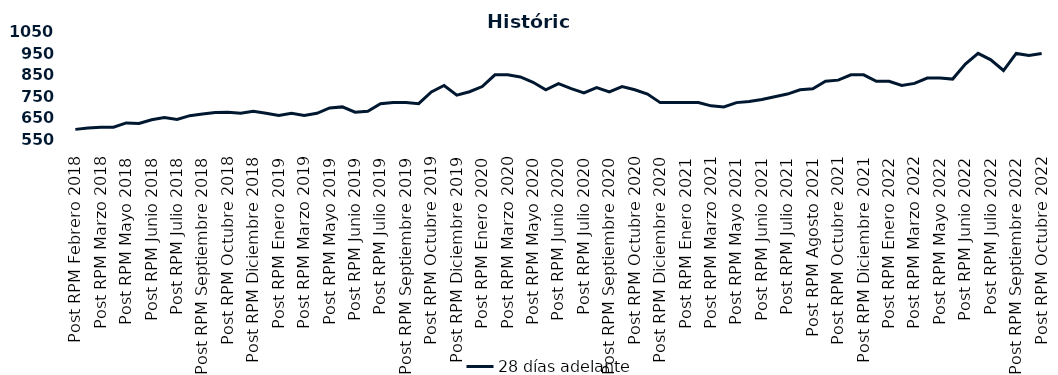
| Category | 28 días adelante |
|---|---|
| Post RPM Febrero 2018 | 595 |
| Pre RPM Marzo 2018 | 601 |
| Post RPM Marzo 2018 | 605 |
| Pre RPM Mayo 2018 | 605 |
| Post RPM Mayo 2018 | 625 |
| Pre RPM Junio 2018 | 623 |
| Post RPM Junio 2018 | 640 |
| Pre RPM Julio 2018 | 650 |
| Post RPM Julio 2018 | 641 |
| Pre RPM Septiembre 2018 | 659 |
| Post RPM Septiembre 2018 | 666.75 |
| Pre RPM Octubre 2018 | 674 |
| Post RPM Octubre 2018 | 675 |
| Pre RPM Diciembre 2018 | 670 |
| Post RPM Diciembre 2018 | 680 |
| Pre RPM Enero 2019 | 670 |
| Post RPM Enero 2019 | 660 |
| Pre RPM Marzo 2019 | 670 |
| Post RPM Marzo 2019 | 660 |
| Pre RPM Mayo 2019 | 670 |
| Post RPM Mayo 2019 | 695 |
| Pre RPM Junio 2019 | 700 |
| Post RPM Junio 2019 | 675 |
| Pre RPM Julio 2019 | 680 |
| Post RPM Julio 2019 | 715 |
| Pre RPM Septiembre 2019 | 720 |
| Post RPM Septiembre 2019 | 720 |
| Pre RPM Octubre 2019 | 715 |
| Post RPM Octubre 2019 | 770 |
| Pre RPM Diciembre 2019 | 800 |
| Post RPM Diciembre 2019 | 755 |
| Pre RPM Enero 2020 | 771 |
| Post RPM Enero 2020 | 795 |
| Pre RPM Marzo 2020 | 850 |
| Post RPM Marzo 2020 | 850 |
| Pre RPM Mayo 2020 | 840 |
| Post RPM Mayo 2020 | 815 |
| Pre RPM Junio 2020 | 780 |
| Post RPM Junio 2020 | 809 |
| Pre RPM Julio 2020 | 785.72 |
| Post RPM Julio 2020 | 765 |
| Pre RPM Septiembre 2020 | 790 |
| Post RPM Septiembre 2020 | 770 |
| Pre RPM Octubre 2020 | 795 |
| Post RPM Octubre 2020 | 780 |
| Pre RPM Diciembre 2020 | 760 |
| Post RPM Diciembre 2020 | 720 |
| Pre RPM Enero 2021 | 720 |
| Post RPM Enero 2021 | 720 |
| Pre RPM Marzo 2021 | 720 |
| Post RPM Marzo 2021 | 705 |
| Pre RPM Mayo 2021 | 700 |
| Post RPM Mayo 2021 | 720 |
| Pre RPM Junio 2021 | 725 |
| Post RPM Junio 2021 | 735 |
| Pre RPM Julio 2021 | 747.5 |
| Post RPM Julio 2021 | 760 |
| Pre RPM Agosto 2021 | 780 |
| Post RPM Agosto 2021 | 785 |
| Pre RPM Octubre 2021 | 820 |
| Post RPM Octubre 2021 | 825 |
| Pre RPM Diciembre 2021 | 850 |
| Post RPM Diciembre 2021 | 850 |
| Pre RPM Enero 2022 | 820 |
| Post RPM Enero 2022 | 820 |
| Pre RPM Marzo 2022 | 800 |
| Post RPM Marzo 2022 | 810 |
| Pre RPM Mayo 2022 | 835 |
| Post RPM Mayo 2022 | 835 |
| Pre RPM Junio 2022 | 830 |
| Post RPM Junio 2022 | 900 |
| Pre RPM Julio 2022 | 950 |
| Post RPM Julio 2022 | 920 |
| Pre RPM Septiembre 2022 | 870 |
| Post RPM Septiembre 2022 | 950 |
| Pre RPM Octubre 2022 | 940 |
| Post RPM Octubre 2022 | 950 |